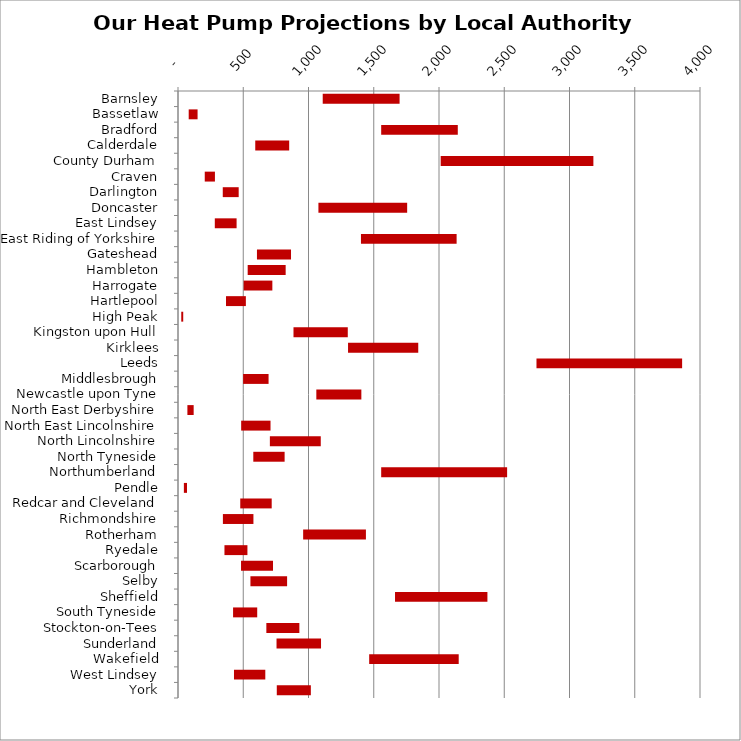
| Category | MIN | MAX |
|---|---|---|
| Barnsley | 1109 | 589 |
| Bassetlaw | 82 | 68 |
| Bradford | 1557 | 587 |
| Calderdale | 592 | 260 |
| County Durham | 2013 | 1170 |
| Craven | 205 | 78 |
| Darlington | 343 | 122 |
| Doncaster | 1076 | 680 |
| East Lindsey | 282 | 167 |
| East Riding of Yorkshire | 1402 | 733 |
| Gateshead | 605 | 261 |
| Hambleton | 534 | 291 |
| Harrogate | 503 | 220 |
| Hartlepool | 368 | 152 |
| High Peak | 25 | 15 |
| Kingston upon Hull | 885 | 416 |
| Kirklees | 1303 | 538 |
| Leeds | 2747 | 1116 |
| Middlesbrough | 499 | 195 |
| Newcastle upon Tyne | 1060 | 345 |
| North East Derbyshire | 72 | 48 |
| North East Lincolnshire | 484 | 225 |
| North Lincolnshire | 704 | 390 |
| North Tyneside | 577 | 240 |
| Northumberland | 1557 | 965 |
| Pendle | 45 | 24 |
| Redcar and Cleveland | 477 | 241 |
| Richmondshire | 344 | 234 |
| Rotherham | 959 | 481 |
| Ryedale | 356 | 176 |
| Scarborough | 483 | 245 |
| Selby | 555 | 281 |
| Sheffield | 1663 | 708 |
| South Tyneside | 422 | 185 |
| Stockton-on-Tees | 677 | 253 |
| Sunderland | 755 | 341 |
| Wakefield | 1465 | 686 |
| West Lindsey | 429 | 240 |
| York | 757 | 261 |